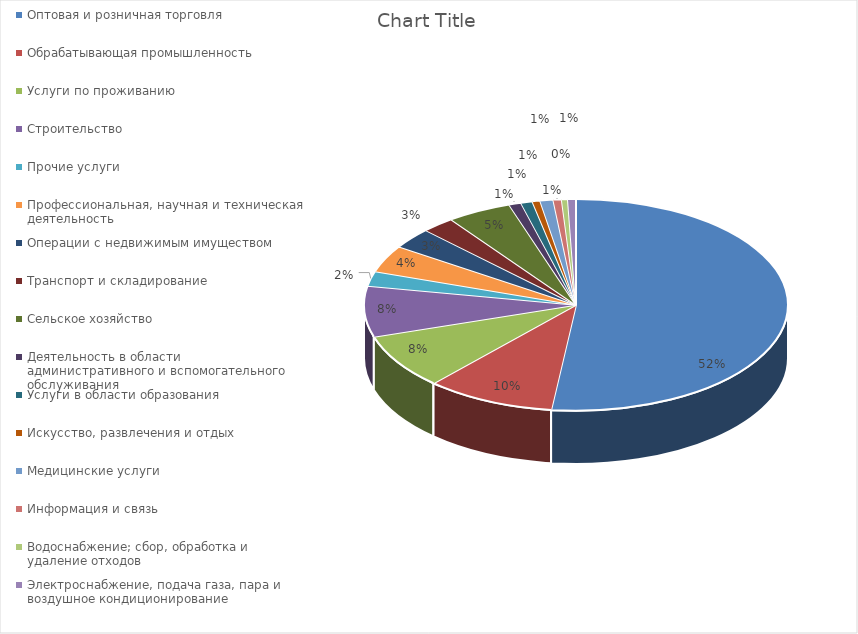
| Category | Series 0 |
|---|---|
| Оптовая и розничная торговля | 0.519 |
| Обрабатывающая промышленность | 0.099 |
| Услуги по проживанию | 0.084 |
| Строительство | 0.078 |
| Прочие услуги | 0.023 |
| Профессиональная, научная и техническая деятельность | 0.041 |
| Операции с недвижимым имуществом | 0.032 |
| Транспорт и складирование | 0.025 |
| Сельское хозяйство | 0.049 |
| Деятельность в области административного и вспомогательного обслуживания | 0.009 |
| Услуги в области образования | 0.009 |
| Искусство, развлечения и отдых | 0.006 |
| Медицинские услуги | 0.01 |
| Информация и связь | 0.006 |
| Водоснабжение; сбор, обработка и удаление отходов | 0.005 |
| Электроснабжение, подача газа, пара и воздушное кондиционирование | 0.006 |